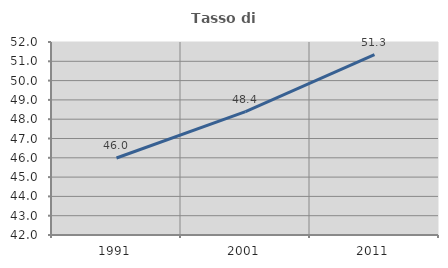
| Category | Tasso di occupazione   |
|---|---|
| 1991.0 | 45.991 |
| 2001.0 | 48.389 |
| 2011.0 | 51.345 |